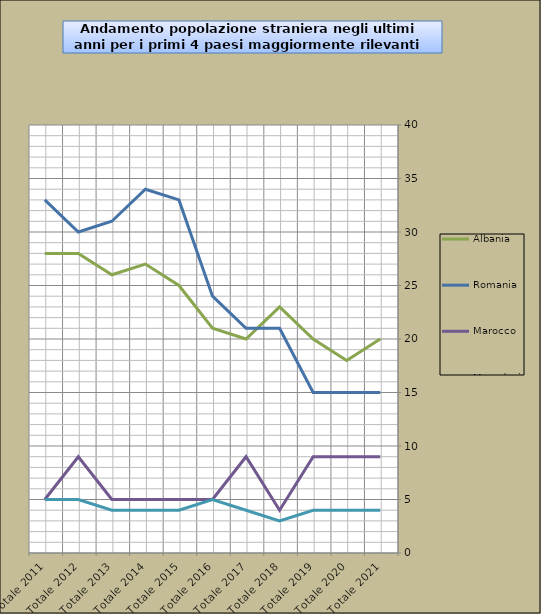
| Category | Albania | Romania | Marocco | Macedonia | Repubblica Dominicana |
|---|---|---|---|---|---|
| Totale 2021 | 20 | 15 | 9 | 4 |  |
| Totale 2020 | 18 | 15 | 9 | 4 |  |
| Totale 2019 | 20 | 15 | 9 | 4 |  |
| Totale 2018 | 23 | 21 | 4 | 3 |  |
| Totale 2017 | 20 | 21 | 9 | 4 |  |
| Totale 2016 | 21 | 24 | 5 | 5 |  |
| Totale 2015 | 25 | 33 | 5 | 4 |  |
| Totale 2014 | 27 | 34 | 5 | 4 |  |
| Totale 2013 | 26 | 31 | 5 | 4 |  |
| Totale 2012 | 28 | 30 | 9 | 5 |  |
| Totale 2011 | 28 | 33 | 5 | 5 |  |